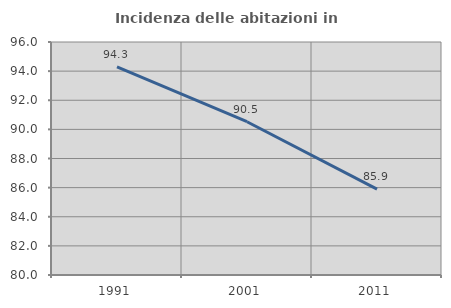
| Category | Incidenza delle abitazioni in proprietà  |
|---|---|
| 1991.0 | 94.286 |
| 2001.0 | 90.526 |
| 2011.0 | 85.897 |